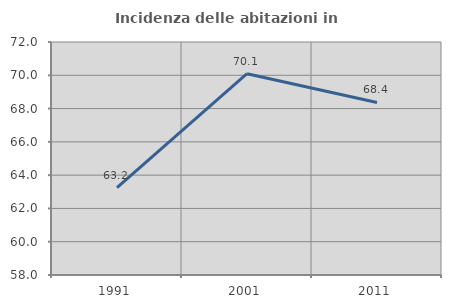
| Category | Incidenza delle abitazioni in proprietà  |
|---|---|
| 1991.0 | 63.248 |
| 2001.0 | 70.093 |
| 2011.0 | 68.367 |